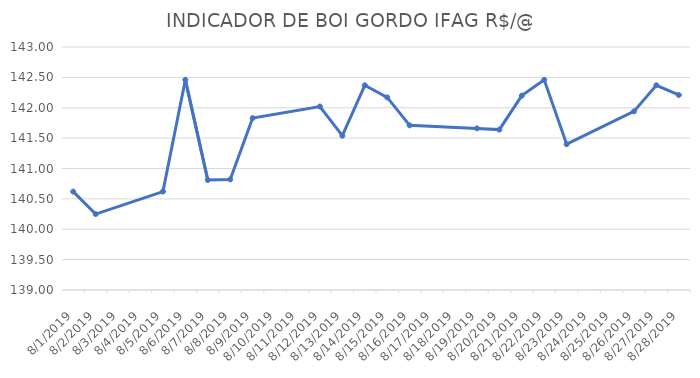
| Category | INDICADOR DE BOI GORDO IFAG |
|---|---|
| 8/1/19 | 140.62 |
| 8/2/19 | 140.25 |
| 8/5/19 | 140.62 |
| 8/6/19 | 142.46 |
| 8/7/19 | 140.81 |
| 8/8/19 | 140.82 |
| 8/9/19 | 141.83 |
| 8/12/19 | 142.02 |
| 8/13/19 | 141.54 |
| 8/14/19 | 142.37 |
| 8/15/19 | 142.17 |
| 8/16/19 | 141.71 |
| 8/19/19 | 141.66 |
| 8/20/19 | 141.64 |
| 8/21/19 | 142.2 |
| 8/22/19 | 142.46 |
| 8/23/19 | 141.4 |
| 8/26/19 | 141.94 |
| 8/27/19 | 142.37 |
| 8/28/19 | 142.21 |